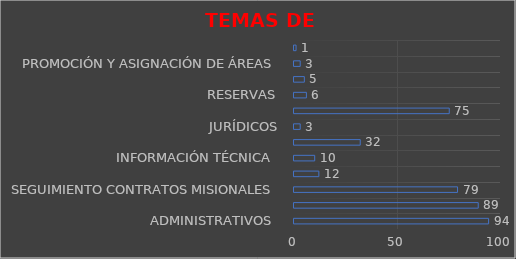
| Category | Series 0 |
|---|---|
| ADMINISTRATIVOS  | 94 |
| AMBIENTAL Y COMUNIDADES  | 89 |
| SEGUIMIENTO CONTRATOS MISIONALES  | 79 |
| REGALIAS Y DERECHOS ECONÓMICOS | 12 |
| INFORMACIÓN TÉCNICA  | 10 |
| REQUERIMIENTOS ESPECIALES | 32 |
| JURÍDICOS | 3 |
| MAPA DE ÁREAS | 75 |
| RESERVAS | 6 |
| OPERACIONES | 5 |
| PROMOCIÓN Y ASIGNACIÓN DE ÁREAS | 3 |
| FISCALIZACIÓN | 1 |